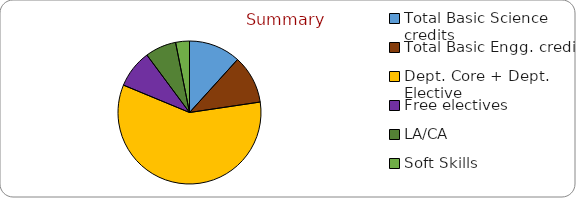
| Category | Series 0 |
|---|---|
| Total Basic Science credits  | 15 |
| Total Basic Engg. credits | 14 |
| Dept. Core + Dept. Elective | 75 |
| Free electives | 11 |
| LA/CA | 9 |
| Soft Skills  | 4 |